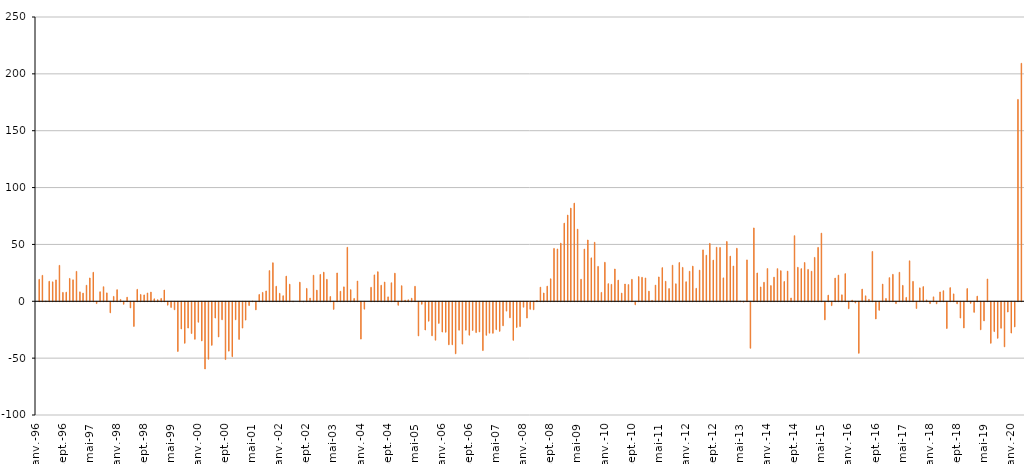
| Category | Variations DEFM ABC (axe de droite) |
|---|---|
| 1996-01-01 | 0 |
| 1996-02-01 | 19.3 |
| 1996-03-01 | 22.8 |
| 1996-04-01 | 0.3 |
| 1996-05-01 | 17.6 |
| 1996-06-01 | 17.1 |
| 1996-07-01 | 18.8 |
| 1996-08-01 | 31.6 |
| 1996-09-01 | 7.8 |
| 1996-10-01 | 8 |
| 1996-11-01 | 20.1 |
| 1996-12-01 | 18.9 |
| 1997-01-01 | 26.3 |
| 1997-02-01 | 8.3 |
| 1997-03-01 | 7.2 |
| 1997-04-01 | 14.1 |
| 1997-05-01 | 20.5 |
| 1997-06-01 | 25.5 |
| 1997-07-01 | -1.6 |
| 1997-08-01 | 8.4 |
| 1997-09-01 | 12.8 |
| 1997-10-01 | 7.4 |
| 1997-11-01 | -9.7 |
| 1997-12-01 | 4.3 |
| 1998-01-01 | 10.2 |
| 1998-02-01 | 1.6 |
| 1998-03-01 | -2.2 |
| 1998-04-01 | 3.6 |
| 1998-05-01 | -5.4 |
| 1998-06-01 | -21.7 |
| 1998-07-01 | 10.5 |
| 1998-08-01 | 6 |
| 1998-09-01 | 5.6 |
| 1998-10-01 | 7.3 |
| 1998-11-01 | 8.1 |
| 1998-12-01 | 2.2 |
| 1999-01-01 | 1.4 |
| 1999-02-01 | 2.5 |
| 1999-03-01 | 9.9 |
| 1999-04-01 | -3 |
| 1999-05-01 | -5 |
| 1999-06-01 | -7 |
| 1999-07-01 | -43.7 |
| 1999-08-01 | -23.9 |
| 1999-09-01 | -36.5 |
| 1999-10-01 | -23.1 |
| 1999-11-01 | -27.9 |
| 1999-12-01 | -33 |
| 2000-01-01 | -18 |
| 2000-02-01 | -34.4 |
| 2000-03-01 | -59.1 |
| 2000-04-01 | -50.5 |
| 2000-05-01 | -38.3 |
| 2000-06-01 | -14.3 |
| 2000-07-01 | -30.9 |
| 2000-08-01 | -15.8 |
| 2000-09-01 | -50.8 |
| 2000-10-01 | -43.4 |
| 2000-11-01 | -48.3 |
| 2000-12-01 | -15.8 |
| 2001-01-01 | -33.1 |
| 2001-02-01 | -23.1 |
| 2001-03-01 | -16.1 |
| 2001-04-01 | -3.3 |
| 2001-05-01 | 0.3 |
| 2001-06-01 | -7.1 |
| 2001-07-01 | 6 |
| 2001-08-01 | 7.8 |
| 2001-09-01 | 9.1 |
| 2001-10-01 | 27 |
| 2001-11-01 | 33.9 |
| 2001-12-01 | 13.2 |
| 2002-01-01 | 7 |
| 2002-02-01 | 4.9 |
| 2002-03-01 | 22.1 |
| 2002-04-01 | 15 |
| 2002-05-01 | 0.1 |
| 2002-06-01 | 0 |
| 2002-07-01 | 16.8 |
| 2002-08-01 | -0.1 |
| 2002-09-01 | 11.3 |
| 2002-10-01 | 2.8 |
| 2002-11-01 | 22.9 |
| 2002-12-01 | 9.8 |
| 2003-01-01 | 23.6 |
| 2003-02-01 | 25.6 |
| 2003-03-01 | 19.3 |
| 2003-04-01 | 4.2 |
| 2003-05-01 | -6.7 |
| 2003-06-01 | 24.9 |
| 2003-07-01 | 8.8 |
| 2003-08-01 | 12.7 |
| 2003-09-01 | 47.5 |
| 2003-10-01 | 10.2 |
| 2003-11-01 | 2.5 |
| 2003-12-01 | 17.8 |
| 2004-01-01 | -32.8 |
| 2004-02-01 | -6.5 |
| 2004-03-01 | 0 |
| 2004-04-01 | 12.3 |
| 2004-05-01 | 23.2 |
| 2004-06-01 | 26 |
| 2004-07-01 | 14.1 |
| 2004-08-01 | 16.9 |
| 2004-09-01 | 3.9 |
| 2004-10-01 | 16.3 |
| 2004-11-01 | 24.7 |
| 2004-12-01 | -3.1 |
| 2005-01-01 | 13.7 |
| 2005-02-01 | 1 |
| 2005-03-01 | 1.3 |
| 2005-04-01 | 2.7 |
| 2005-05-01 | 13.2 |
| 2005-06-01 | -30 |
| 2005-07-01 | -2.2 |
| 2005-08-01 | -24.8 |
| 2005-09-01 | -17.1 |
| 2005-10-01 | -29.9 |
| 2005-11-01 | -33.8 |
| 2005-12-01 | -19 |
| 2006-01-01 | -26.6 |
| 2006-02-01 | -26.8 |
| 2006-03-01 | -37.8 |
| 2006-04-01 | -37.8 |
| 2006-05-01 | -45.7 |
| 2006-06-01 | -25 |
| 2006-07-01 | -37.2 |
| 2006-08-01 | -25 |
| 2006-09-01 | -29.4 |
| 2006-10-01 | -25.2 |
| 2006-11-01 | -27.1 |
| 2006-12-01 | -26.5 |
| 2007-01-01 | -42.9 |
| 2007-02-01 | -29.5 |
| 2007-03-01 | -27.6 |
| 2007-04-01 | -27.7 |
| 2007-05-01 | -24.5 |
| 2007-06-01 | -26 |
| 2007-07-01 | -21.1 |
| 2007-08-01 | -8.2 |
| 2007-09-01 | -14.1 |
| 2007-10-01 | -33.9 |
| 2007-11-01 | -22.6 |
| 2007-12-01 | -21.8 |
| 2008-01-01 | -4.8 |
| 2008-02-01 | -14.3 |
| 2008-03-01 | -6.6 |
| 2008-04-01 | -7 |
| 2008-05-01 | 0.7 |
| 2008-06-01 | 12.4 |
| 2008-07-01 | 7.3 |
| 2008-08-01 | 13.3 |
| 2008-09-01 | 19.8 |
| 2008-10-01 | 46.5 |
| 2008-11-01 | 46 |
| 2008-12-01 | 51.1 |
| 2009-01-01 | 68.7 |
| 2009-02-01 | 75.8 |
| 2009-03-01 | 81.9 |
| 2009-04-01 | 86.3 |
| 2009-05-01 | 63.4 |
| 2009-06-01 | 19.4 |
| 2009-07-01 | 45.9 |
| 2009-08-01 | 53.9 |
| 2009-09-01 | 38.2 |
| 2009-10-01 | 51.9 |
| 2009-11-01 | 30.7 |
| 2009-12-01 | 7.8 |
| 2010-01-01 | 34.3 |
| 2010-02-01 | 15.5 |
| 2010-03-01 | 14.9 |
| 2010-04-01 | 28.4 |
| 2010-05-01 | 18.6 |
| 2010-06-01 | 7.2 |
| 2010-07-01 | 15.2 |
| 2010-08-01 | 14.7 |
| 2010-09-01 | 19.3 |
| 2010-10-01 | -2.6 |
| 2010-11-01 | 21.7 |
| 2010-12-01 | 21.1 |
| 2011-01-01 | 20.5 |
| 2011-02-01 | 8.9 |
| 2011-03-01 | 0.8 |
| 2011-04-01 | 14.2 |
| 2011-05-01 | 21.4 |
| 2011-06-01 | 29.6 |
| 2011-07-01 | 17.6 |
| 2011-08-01 | 11.2 |
| 2011-09-01 | 31.7 |
| 2011-10-01 | 15.4 |
| 2011-11-01 | 34.1 |
| 2011-12-01 | 29.8 |
| 2012-01-01 | 17.2 |
| 2012-02-01 | 26.4 |
| 2012-03-01 | 30.9 |
| 2012-04-01 | 11.4 |
| 2012-05-01 | 27.4 |
| 2012-06-01 | 45.2 |
| 2012-07-01 | 40.5 |
| 2012-08-01 | 50.9 |
| 2012-09-01 | 36.2 |
| 2012-10-01 | 47.5 |
| 2012-11-01 | 47.3 |
| 2012-12-01 | 20.6 |
| 2013-01-01 | 52.6 |
| 2013-02-01 | 39.7 |
| 2013-03-01 | 31 |
| 2013-04-01 | 46.6 |
| 2013-05-01 | 0.3 |
| 2013-06-01 | -0.3 |
| 2013-07-01 | 36.4 |
| 2013-08-01 | -40.9 |
| 2013-09-01 | 64.5 |
| 2013-10-01 | 24.9 |
| 2013-11-01 | 12.6 |
| 2013-12-01 | 16.7 |
| 2014-01-01 | 28.8 |
| 2014-02-01 | 13.8 |
| 2014-03-01 | 21.2 |
| 2014-04-01 | 28.7 |
| 2014-05-01 | 26.9 |
| 2014-06-01 | 17.4 |
| 2014-07-01 | 26.5 |
| 2014-08-01 | 2.9 |
| 2014-09-01 | 57.7 |
| 2014-10-01 | 29.9 |
| 2014-11-01 | 28.7 |
| 2014-12-01 | 34.1 |
| 2015-01-01 | 28 |
| 2015-02-01 | 26.4 |
| 2015-03-01 | 38.6 |
| 2015-04-01 | 47.4 |
| 2015-05-01 | 59.9 |
| 2015-06-01 | -15.9 |
| 2015-07-01 | 5.4 |
| 2015-08-01 | -3.4 |
| 2015-09-01 | 20.4 |
| 2015-10-01 | 23 |
| 2015-11-01 | 5.7 |
| 2015-12-01 | 24.3 |
| 2016-01-01 | -6.1 |
| 2016-02-01 | 1 |
| 2016-03-01 | -1.1 |
| 2016-04-01 | -45.3 |
| 2016-05-01 | 10.7 |
| 2016-06-01 | 4.8 |
| 2016-07-01 | 1.7 |
| 2016-08-01 | 43.8 |
| 2016-09-01 | -15.1 |
| 2016-10-01 | -7.5 |
| 2016-11-01 | 15.1 |
| 2016-12-01 | 2.5 |
| 2017-01-01 | 20.8 |
| 2017-02-01 | 23.7 |
| 2017-03-01 | -1.6 |
| 2017-04-01 | 25.5 |
| 2017-05-01 | 14 |
| 2017-06-01 | 3.4 |
| 2017-07-01 | 35.6 |
| 2017-08-01 | 17.5 |
| 2017-09-01 | -5.9 |
| 2017-10-01 | 11.8 |
| 2017-11-01 | 12.9 |
| 2017-12-01 | 1.2 |
| 2018-01-01 | -1.6 |
| 2018-02-01 | 3.9 |
| 2018-03-01 | -1.8 |
| 2018-04-01 | 8.2 |
| 2018-05-01 | 9.3 |
| 2018-06-01 | -23.5 |
| 2018-07-01 | 12 |
| 2018-08-01 | 6.5 |
| 2018-09-01 | -1.8 |
| 2018-10-01 | -14.3 |
| 2018-11-01 | -23 |
| 2018-12-01 | 11.2 |
| 2019-01-01 | -1.4 |
| 2019-02-01 | -9.3 |
| 2019-03-01 | 4.5 |
| 2019-04-01 | -24.6 |
| 2019-05-01 | -16.8 |
| 2019-06-01 | 19.6 |
| 2019-07-01 | -36.5 |
| 2019-08-01 | -26.2 |
| 2019-09-01 | -32.1 |
| 2019-10-01 | -23.3 |
| 2019-11-01 | -39.6 |
| 2019-12-01 | -9 |
| 2020-01-01 | -27.5 |
| 2020-02-01 | -22.1 |
| 2020-03-01 | 177.5 |
| 2020-04-01 | 209.3 |
| 2020-05-01 | 61 |